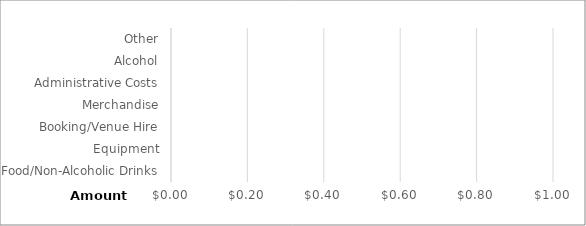
| Category | Amount |
|---|---|
| Food/Non-Alcoholic Drinks | 0 |
| Equipment | 0 |
| Booking/Venue Hire | 0 |
| Merchandise | 0 |
| Administrative Costs | 0 |
| Alcohol | 0 |
| Other | 0 |